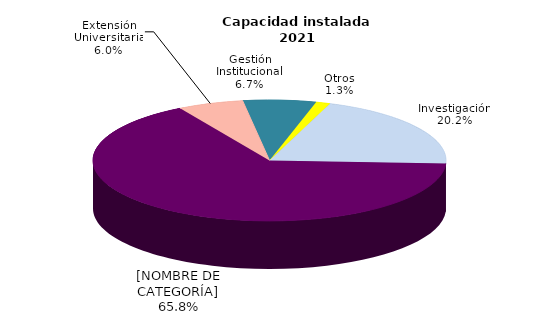
| Category | Series 0 |
|---|---|
| Investigación | 20.236 |
| Docencia | 65.75 |
| Extensión Universitaria | 6.025 |
| Gestión Institucional | 6.68 |
| Otros | 1.31 |